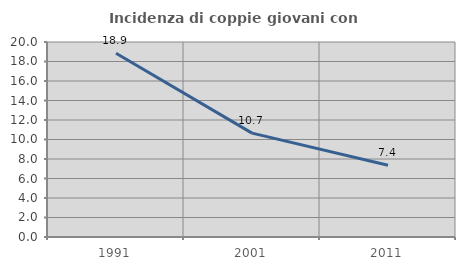
| Category | Incidenza di coppie giovani con figli |
|---|---|
| 1991.0 | 18.852 |
| 2001.0 | 10.653 |
| 2011.0 | 7.363 |